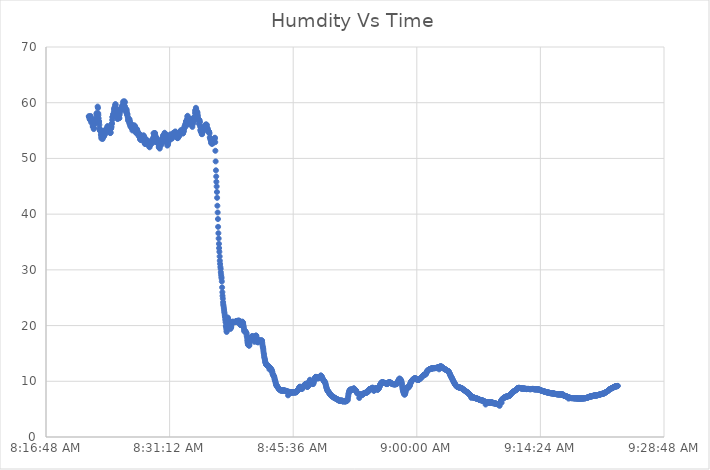
| Category | Series 0 |
|---|---|
| 42902.34846064815 | 57.571 |
| 42902.3484837963 | 57.523 |
| 42902.348495370374 | 57.436 |
| 42902.34851851852 | 57.364 |
| 42902.3485300926 | 57.088 |
| 42902.348553240736 | 56.951 |
| 42902.34856481482 | 57.135 |
| 42902.34858796296 | 57.487 |
| 42902.34861111111 | 57.617 |
| 42902.34862268518 | 57.181 |
| 42902.348645833335 | 56.824 |
| 42902.348657407405 | 56.481 |
| 42902.34868055556 | 56.993 |
| 42902.34869212963 | 57.133 |
| 42902.34871527778 | 56.679 |
| 42902.34873842592 | 56.802 |
| 42902.348750000005 | 56.617 |
| 42902.348773148144 | 56.071 |
| 42902.34878472223 | 55.691 |
| 42902.34880787037 | 55.78 |
| 42902.34881944445 | 55.854 |
| 42902.34884259259 | 55.624 |
| 42902.34886574074 | 55.266 |
| 42902.34887731481 | 55.454 |
| 42902.34890046297 | 56.164 |
| 42902.348912037036 | 56.694 |
| 42902.34893518519 | 56.746 |
| 42902.34894675926 | 56.82 |
| 42902.34896990741 | 56.906 |
| 42902.34898148148 | 56.856 |
| 42902.34900462963 | 56.399 |
| 42902.349027777775 | 56.394 |
| 42902.34903935185 | 56.785 |
| 42902.3490625 | 57.356 |
| 42902.34908564815 | 57.986 |
| 42902.34909722222 | 58.134 |
| 42902.349120370374 | 57.883 |
| 42902.34917824074 | 59.304 |
| 42902.34920138889 | 59.05 |
| 42902.349224537036 | 58.099 |
| 42902.34923611111 | 57.751 |
| 42902.34925925926 | 57.194 |
| 42902.349282407406 | 56.665 |
| 42902.34929398148 | 56.574 |
| 42902.34931712963 | 56.044 |
| 42902.349328703705 | 55.42 |
| 42902.34935185185 | 55.122 |
| 42902.34936342592 | 55.009 |
| 42902.349386574075 | 54.946 |
| 42902.34940972222 | 55.121 |
| 42902.3494212963 | 55.012 |
| 42902.349444444444 | 54.326 |
| 42902.34945601852 | 54.165 |
| 42902.34947916667 | 53.788 |
| 42902.349490740744 | 53.561 |
| 42902.34951388889 | 53.738 |
| 42902.34953703704 | 53.953 |
| 42902.34954861111 | 54.308 |
| 42902.34957175926 | 53.746 |
| 42902.34958333333 | 53.486 |
| 42902.34960648148 | 53.768 |
| 42902.34962962963 | 53.998 |
| 42902.349641203706 | 54.842 |
| 42902.34966435185 | 54.798 |
| 42902.3496875 | 54.356 |
| 42902.349699074075 | 53.967 |
| 42902.34972222222 | 54.149 |
| 42902.349745370375 | 54.293 |
| 42902.349768518514 | 54.377 |
| 42902.34979166667 | 55.054 |
| 42902.34980324074 | 54.883 |
| 42902.34982638889 | 54.853 |
| 42902.349849537044 | 55.26 |
| 42902.34986111111 | 54.956 |
| 42902.34988425925 | 55.215 |
| 42902.34989583334 | 55.299 |
| 42902.349918981476 | 55.247 |
| 42902.34993055556 | 55.167 |
| 42902.3499537037 | 55.414 |
| 42902.34996527778 | 55.686 |
| 42902.34998842592 | 55.815 |
| 42902.350011574075 | 55.551 |
| 42902.35003472222 | 55.135 |
| 42902.3500462963 | 55.289 |
| 42902.350069444445 | 54.943 |
| 42902.35008101852 | 54.953 |
| 42902.35010416666 | 54.772 |
| 42902.350115740745 | 54.876 |
| 42902.35013888888 | 54.779 |
| 42902.35016203704 | 54.657 |
| 42902.35017361111 | 54.893 |
| 42902.35019675926 | 54.55 |
| 42902.35020833333 | 54.609 |
| 42902.35023148148 | 54.681 |
| 42902.35024305555 | 55.31 |
| 42902.350266203706 | 55.404 |
| 42902.350277777776 | 55.486 |
| 42902.35030092593 | 55.73 |
| 42902.35032407407 | 56.229 |
| 42902.35033564815 | 56.304 |
| 42902.35035879629 | 56.907 |
| 42902.350370370375 | 57.427 |
| 42902.350393518514 | 57.46 |
| 42902.35041666667 | 57.494 |
| 42902.35042824074 | 57.866 |
| 42902.35045138889 | 57.889 |
| 42902.35046296296 | 57.999 |
| 42902.350486111114 | 58.299 |
| 42902.35050925926 | 58.71 |
| 42902.35052083334 | 58.928 |
| 42902.35054398148 | 59.124 |
| 42902.35055555556 | 58.975 |
| 42902.3505787037 | 59.14 |
| 42902.35059027778 | 59.464 |
| 42902.35061342592 | 59.761 |
| 42902.350636574076 | 59.614 |
| 42902.350648148145 | 59 |
| 42902.3506712963 | 58.849 |
| 42902.35068287037 | 58.852 |
| 42902.35070601852 | 58.213 |
| 42902.35071759259 | 58.135 |
| 42902.350740740745 | 57.909 |
| 42902.350763888884 | 57.803 |
| 42902.35077546297 | 57.182 |
| 42902.35079861111 | 57.069 |
| 42902.35081018519 | 57.222 |
| 42902.35083333333 | 57.658 |
| 42902.350856481484 | 58.204 |
| 42902.35086805555 | 57.992 |
| 42902.35089120371 | 57.689 |
| 42902.350914351846 | 57.244 |
| 42902.3509375 | 57.223 |
| 42902.35096064815 | 57.842 |
| 42902.35097222222 | 58.209 |
| 42902.350995370376 | 58.821 |
| 42902.351018518515 | 58.646 |
| 42902.3510300926 | 58.915 |
| 42902.35105324074 | 58.618 |
| 42902.35107638889 | 58.968 |
| 42902.35109953703 | 59.17 |
| 42902.351111111115 | 58.862 |
| 42902.351134259254 | 59.118 |
| 42902.35115740741 | 59.461 |
| 42902.35116898148 | 58.892 |
| 42902.35119212963 | 59.161 |
| 42902.35121527778 | 59.458 |
| 42902.35122685185 | 59.629 |
| 42902.35125 | 60.123 |
| 42902.35126157408 | 60.238 |
| 42902.35128472222 | 59.785 |
| 42902.3512962963 | 59.336 |
| 42902.35131944444 | 60.028 |
| 42902.35133101852 | 60.094 |
| 42902.35135416666 | 60.245 |
| 42902.351377314815 | 60.065 |
| 42902.351388888885 | 59.368 |
| 42902.35141203704 | 58.669 |
| 42902.35142361111 | 58.712 |
| 42902.35144675926 | 58.731 |
| 42902.35145833333 | 58.577 |
| 42902.351481481484 | 58.297 |
| 42902.35150462963 | 58.854 |
| 42902.35151620371 | 58.711 |
| 42902.35153935185 | 58.375 |
| 42902.35155092593 | 57.865 |
| 42902.35157407407 | 57.957 |
| 42902.35158564815 | 57.937 |
| 42902.35160879629 | 57.513 |
| 42902.351631944446 | 57.219 |
| 42902.351643518516 | 56.784 |
| 42902.35166666667 | 56.9 |
| 42902.351689814815 | 56.914 |
| 42902.35170138889 | 56.878 |
| 42902.35172453704 | 57.088 |
| 42902.351736111115 | 56.322 |
| 42902.35175925926 | 56.997 |
| 42902.35178240741 | 56.703 |
| 42902.35179398148 | 56.173 |
| 42902.35181712963 | 55.996 |
| 42902.3518287037 | 55.759 |
| 42902.351851851854 | 55.805 |
| 42902.351875 | 56.235 |
| 42902.35188657408 | 56.019 |
| 42902.35190972222 | 55.5 |
| 42902.35193287037 | 55.498 |
| 42902.35194444444 | 55.526 |
| 42902.35196759259 | 55.481 |
| 42902.351990740746 | 55.027 |
| 42902.352013888885 | 55.55 |
| 42902.35202546297 | 55.899 |
| 42902.35204861111 | 55.892 |
| 42902.352060185185 | 55.513 |
| 42902.35208333333 | 55.086 |
| 42902.352106481485 | 55.217 |
| 42902.352118055554 | 55.479 |
| 42902.35214120371 | 55.936 |
| 42902.35215277778 | 55.814 |
| 42902.35217592593 | 55.864 |
| 42902.35219907407 | 55.746 |
| 42902.352210648154 | 55.464 |
| 42902.35223379629 | 55.41 |
| 42902.35224537037 | 55.284 |
| 42902.352268518516 | 54.992 |
| 42902.35228009259 | 54.612 |
| 42902.35230324074 | 54.564 |
| 42902.35231481481 | 54.794 |
| 42902.35233796296 | 55.173 |
| 42902.352361111116 | 55.259 |
| 42902.352372685185 | 54.772 |
| 42902.35239583333 | 54.613 |
| 42902.35240740741 | 54.945 |
| 42902.352430555555 | 54.568 |
| 42902.35244212963 | 54.533 |
| 42902.35246527778 | 54.427 |
| 42902.352488425924 | 54.036 |
| 42902.3525 | 54.229 |
| 42902.35252314815 | 54.39 |
| 42902.35253472222 | 54.463 |
| 42902.35255787037 | 54.332 |
| 42902.35256944444 | 54.27 |
| 42902.35259259259 | 53.899 |
| 42902.35260416666 | 53.489 |
| 42902.352627314816 | 53.452 |
| 42902.35265046296 | 53.555 |
| 42902.35266203704 | 53.297 |
| 42902.352685185186 | 53.419 |
| 42902.35269675926 | 53.441 |
| 42902.35271990741 | 53.328 |
| 42902.352731481486 | 53.546 |
| 42902.352754629625 | 53.976 |
| 42902.35277777778 | 53.828 |
| 42902.35278935185 | 53.784 |
| 42902.3528125 | 53.717 |
| 42902.35282407407 | 53.97 |
| 42902.352847222224 | 53.924 |
| 42902.352858796294 | 54.056 |
| 42902.35288194445 | 53.942 |
| 42902.35289351852 | 54.149 |
| 42902.35291666667 | 54.006 |
| 42902.35293981482 | 53.829 |
| 42902.35295138889 | 53.189 |
| 42902.35297453703 | 52.791 |
| 42902.352997685186 | 52.622 |
| 42902.353009259255 | 52.709 |
| 42902.35303240741 | 52.6 |
| 42902.35304398148 | 52.687 |
| 42902.35306712963 | 53.103 |
| 42902.35309027778 | 53.32 |
| 42902.353101851855 | 53.437 |
| 42902.353124999994 | 53.366 |
| 42902.35313657408 | 52.906 |
| 42902.35315972222 | 52.644 |
| 42902.35318287037 | 52.919 |
| 42902.35319444444 | 52.858 |
| 42902.353217592594 | 52.875 |
| 42902.35322916666 | 52.486 |
| 42902.35325231482 | 52.725 |
| 42902.35326388889 | 52.999 |
| 42902.35328703704 | 52.771 |
| 42902.35331018518 | 52.711 |
| 42902.35332175926 | 52.312 |
| 42902.3533449074 | 52.487 |
| 42902.353356481486 | 52.181 |
| 42902.353379629625 | 52 |
| 42902.35340277778 | 52.572 |
| 42902.35341435185 | 52.322 |
| 42902.3534375 | 52.458 |
| 42902.35344907407 | 52.463 |
| 42902.353472222225 | 52.938 |
| 42902.35349537037 | 53.089 |
| 42902.35350694445 | 53.041 |
| 42902.35353009259 | 53.224 |
| 42902.35354166667 | 53.206 |
| 42902.35356481481 | 53.103 |
| 42902.35357638889 | 52.876 |
| 42902.35359953703 | 53.251 |
| 42902.35362268519 | 53.06 |
| 42902.353634259256 | 52.785 |
| 42902.35365740741 | 53.05 |
| 42902.35366898148 | 53.607 |
| 42902.35369212963 | 53.788 |
| 42902.3537037037 | 54.516 |
| 42902.353726851856 | 54.475 |
| 42902.353738425925 | 53.998 |
| 42902.35376157408 | 53.848 |
| 42902.35378472222 | 54.066 |
| 42902.353796296295 | 54.518 |
| 42902.35381944444 | 54.55 |
| 42902.35383101852 | 54.269 |
| 42902.353854166664 | 53.942 |
| 42902.35386574074 | 53.487 |
| 42902.35388888889 | 53.27 |
| 42902.35391203704 | 53.297 |
| 42902.35392361111 | 53.788 |
| 42902.35394675926 | 53.663 |
| 42902.35395833333 | 52.976 |
| 42902.35398148149 | 52.951 |
| 42902.353993055556 | 53.3 |
| 42902.35401620371 | 52.744 |
| 42902.35403935185 | 52.769 |
| 42902.354050925926 | 52.688 |
| 42902.35407407407 | 52.971 |
| 42902.35408564815 | 52.771 |
| 42902.354108796295 | 52.675 |
| 42902.35412037037 | 52.049 |
| 42902.35414351852 | 51.967 |
| 42902.35415509259 | 52.093 |
| 42902.35417824074 | 52.508 |
| 42902.354201388895 | 51.767 |
| 42902.354212962964 | 52.197 |
| 42902.35423611112 | 52.533 |
| 42902.35424768519 | 52.884 |
| 42902.35427083333 | 52.653 |
| 42902.35428240741 | 52.737 |
| 42902.35430555555 | 52.375 |
| 42902.3543287037 | 52.626 |
| 42902.35434027777 | 52.701 |
| 42902.354363425926 | 53.345 |
| 42902.354374999995 | 53.381 |
| 42902.35439814815 | 53.559 |
| 42902.35440972222 | 53.038 |
| 42902.35443287037 | 53.188 |
| 42902.35444444444 | 53.677 |
| 42902.354467592595 | 54.117 |
| 42902.354490740734 | 54.017 |
| 42902.35450231482 | 54.073 |
| 42902.35452546296 | 53.671 |
| 42902.35453703704 | 54.044 |
| 42902.35456018518 | 54.254 |
| 42902.354571759264 | 54.323 |
| 42902.3545949074 | 54.605 |
| 42902.35461805556 | 54.187 |
| 42902.354629629626 | 54.471 |
| 42902.35465277778 | 54.194 |
| 42902.35466435185 | 54.343 |
| 42902.3546875 | 54.321 |
| 42902.35469907407 | 54.104 |
| 42902.354722222226 | 53.244 |
| 42902.354733796295 | 52.933 |
| 42902.35475694445 | 53.227 |
| 42902.35478009259 | 53.747 |
| 42902.354791666665 | 52.749 |
| 42902.35481481481 | 52.306 |
| 42902.35482638889 | 52.543 |
| 42902.354849537034 | 52.689 |
| 42902.35486111111 | 52.429 |
| 42902.35488425926 | 52.795 |
| 42902.35490740741 | 53.094 |
| 42902.35491898148 | 53.076 |
| 42902.354942129634 | 53.235 |
| 42902.3549537037 | 53.546 |
| 42902.35497685186 | 53.822 |
| 42902.354999999996 | 54 |
| 42902.35501157407 | 54.05 |
| 42902.35503472222 | 54.027 |
| 42902.355046296296 | 54.271 |
| 42902.35506944444 | 54.285 |
| 42902.35508101852 | 53.67 |
| 42902.355104166665 | 53.923 |
| 42902.35512731482 | 53.875 |
| 42902.35513888889 | 54.072 |
| 42902.35516203704 | 54.156 |
| 42902.35517361111 | 53.515 |
| 42902.355196759265 | 53.661 |
| 42902.355219907404 | 54.01 |
| 42902.35523148149 | 54.046 |
| 42902.35525462963 | 54.21 |
| 42902.355266203704 | 54.158 |
| 42902.35528935185 | 54.265 |
| 42902.35530092593 | 54.593 |
| 42902.35532407407 | 54.455 |
| 42902.35534722223 | 54.225 |
| 42902.355358796296 | 54.256 |
| 42902.35538194445 | 54.62 |
| 42902.35539351852 | 54.513 |
| 42902.35541666667 | 54.289 |
| 42902.35543981481 | 54.73 |
| 42902.355462962965 | 54.84 |
| 42902.355486111104 | 54.704 |
| 42902.35550925926 | 54.416 |
| 42902.35552083333 | 54.352 |
| 42902.35554398148 | 54.328 |
| 42902.35555555555 | 53.979 |
| 42902.355578703704 | 54.156 |
| 42902.35559027777 | 53.804 |
| 42902.35561342593 | 53.708 |
| 42902.35563657407 | 53.631 |
| 42902.35564814815 | 53.707 |
| 42902.355671296296 | 53.666 |
| 42902.35568287037 | 53.748 |
| 42902.35570601851 | 53.949 |
| 42902.355729166666 | 54.314 |
| 42902.355740740735 | 54.179 |
| 42902.35576388889 | 53.956 |
| 42902.35577546296 | 54.125 |
| 42902.35579861111 | 54.383 |
| 42902.35581018518 | 54.719 |
| 42902.355833333335 | 54.755 |
| 42902.35585648148 | 54.518 |
| 42902.35587962963 | 54.46 |
| 42902.355891203704 | 54.702 |
| 42902.35591435185 | 55.066 |
| 42902.35592592593 | 54.693 |
| 42902.35594907407 | 55.016 |
| 42902.35596064814 | 54.699 |
| 42902.3559837963 | 54.753 |
| 42902.35600694444 | 54.989 |
| 42902.35601851852 | 54.819 |
| 42902.356041666666 | 54.585 |
| 42902.35605324074 | 54.761 |
| 42902.35607638889 | 54.474 |
| 42902.356087962966 | 54.523 |
| 42902.35611111111 | 54.68 |
| 42902.35613425926 | 54.933 |
| 42902.356145833335 | 54.885 |
| 42902.35616898148 | 55.323 |
| 42902.35618055555 | 55.431 |
| 42902.356203703705 | 55.724 |
| 42902.356215277774 | 55.592 |
| 42902.35623842593 | 55.588 |
| 42902.356261574074 | 55.88 |
| 42902.35627314815 | 56.105 |
| 42902.3562962963 | 56.123 |
| 42902.356307870374 | 56.314 |
| 42902.35633101852 | 56.608 |
| 42902.3563425926 | 56.72 |
| 42902.356365740736 | 56.426 |
| 42902.35637731482 | 56.681 |
| 42902.35640046296 | 56.858 |
| 42902.35642361111 | 57.076 |
| 42902.35643518518 | 57.5 |
| 42902.356458333335 | 57.652 |
| 42902.35648148148 | 56.986 |
| 42902.35649305556 | 56.43 |
| 42902.3565162037 | 56.088 |
| 42902.35652777778 | 56.23 |
| 42902.35655092592 | 56.406 |
| 42902.356562500005 | 56.815 |
| 42902.356585648144 | 56.884 |
| 42902.35659722223 | 57.104 |
| 42902.35662037037 | 56.883 |
| 42902.35664351852 | 56.778 |
| 42902.35665509259 | 57.137 |
| 42902.35667824074 | 56.904 |
| 42902.35668981481 | 56.577 |
| 42902.35671296297 | 56.357 |
| 42902.356724537036 | 56.259 |
| 42902.35674768519 | 56.366 |
| 42902.35677083333 | 56.511 |
| 42902.35678240741 | 56.831 |
| 42902.35680555555 | 56.683 |
| 42902.35681712963 | 56.456 |
| 42902.356840277775 | 55.659 |
| 42902.35685185185 | 56.051 |
| 42902.356875 | 56.775 |
| 42902.35689814815 | 57.02 |
| 42902.35690972222 | 56.338 |
| 42902.356932870374 | 56.967 |
| 42902.356944444444 | 57.238 |
| 42902.3569675926 | 57.03 |
| 42902.35697916667 | 57.422 |
| 42902.35700231481 | 56.783 |
| 42902.35702546296 | 56.963 |
| 42902.357037037036 | 57.437 |
| 42902.35706018518 | 58.148 |
| 42902.35707175926 | 58.6 |
| 42902.357094907406 | 58.489 |
| 42902.35710648148 | 58.744 |
| 42902.35712962963 | 59.086 |
| 42902.35715277778 | 58.836 |
| 42902.35716435185 | 58.321 |
| 42902.357187500005 | 58.055 |
| 42902.357199074075 | 58.344 |
| 42902.35722222222 | 58.383 |
| 42902.3572337963 | 57.796 |
| 42902.357256944444 | 58.215 |
| 42902.35726851852 | 57.815 |
| 42902.35729166667 | 57.509 |
| 42902.35731481481 | 57.147 |
| 42902.35732638889 | 56.942 |
| 42902.35734953704 | 56.912 |
| 42902.35737268519 | 56.215 |
| 42902.35738425926 | 56.936 |
| 42902.35740740741 | 56.653 |
| 42902.35743055555 | 56.832 |
| 42902.357453703706 | 56.509 |
| 42902.357465277775 | 55.735 |
| 42902.35748842593 | 55.115 |
| 42902.357511574075 | 54.932 |
| 42902.35753472222 | 54.83 |
| 42902.35754629629 | 54.739 |
| 42902.357569444444 | 54.767 |
| 42902.3575925926 | 54.689 |
| 42902.35760416667 | 54.371 |
| 42902.35762731482 | 54.35 |
| 42902.35765046296 | 54.598 |
| 42902.35767361111 | 54.749 |
| 42902.35768518518 | 54.832 |
| 42902.35770833334 | 55.15 |
| 42902.357731481476 | 55.348 |
| 42902.35774305556 | 55.238 |
| 42902.3577662037 | 55.415 |
| 42902.35778935185 | 55.566 |
| 42902.357812500006 | 55.544 |
| 42902.357824074075 | 55.715 |
| 42902.35784722222 | 55.911 |
| 42902.35787037037 | 55.794 |
| 42902.35789351852 | 55.832 |
| 42902.35790509259 | 55.95 |
| 42902.357928240745 | 56.094 |
| 42902.35795138888 | 56.027 |
| 42902.35796296297 | 56.022 |
| 42902.35798611111 | 56.08 |
| 42902.35800925926 | 55.98 |
| 42902.35803240741 | 55.372 |
| 42902.35804398148 | 55.439 |
| 42902.35806712963 | 55.441 |
| 42902.358090277776 | 55.237 |
| 42902.35811342593 | 54.955 |
| 42902.358125 | 54.988 |
| 42902.35814814815 | 54.87 |
| 42902.35817129629 | 54.717 |
| 42902.358182870375 | 54.811 |
| 42902.358206018514 | 54.713 |
| 42902.35822916667 | 54.478 |
| 42902.358252314814 | 53.781 |
| 42902.35828703704 | 53.601 |
| 42902.358310185184 | 53.415 |
| 42902.35833333334 | 53.273 |
| 42902.35834490741 | 53.103 |
| 42902.35836805556 | 52.789 |
| 42902.3583912037 | 52.71 |
| 42902.35841435185 | 52.644 |
| 42902.35842592592 | 52.685 |
| 42902.358449074076 | 52.697 |
| 42902.35847222222 | 52.749 |
| 42902.3584837963 | 52.669 |
| 42902.358506944445 | 52.802 |
| 42902.35853009259 | 52.985 |
| 42902.358553240745 | 53.116 |
| 42902.358564814815 | 53.178 |
| 42902.35858796297 | 53.276 |
| 42902.35861111111 | 53.402 |
| 42902.35863425926 | 53.475 |
| 42902.35864583333 | 53.649 |
| 42902.358668981484 | 53.715 |
| 42902.35869212963 | 52.922 |
| 42902.35870370371 | 51.375 |
| 42902.358726851846 | 49.471 |
| 42902.35875 | 47.867 |
| 42902.35877314815 | 46.764 |
| 42902.35878472222 | 45.81 |
| 42902.358807870376 | 44.97 |
| 42902.358831018515 | 43.973 |
| 42902.3588425926 | 42.931 |
| 42902.35886574074 | 41.507 |
| 42902.35888888889 | 40.298 |
| 42902.35891203703 | 39.123 |
| 42902.358923611115 | 37.721 |
| 42902.358946759254 | 36.58 |
| 42902.35896990741 | 35.633 |
| 42902.35899305556 | 34.67 |
| 42902.35900462963 | 33.914 |
| 42902.35902777778 | 33.24 |
| 42902.35905092592 | 32.411 |
| 42902.3590625 | 31.637 |
| 42902.359085648146 | 31.064 |
| 42902.3591087963 | 30.523 |
| 42902.35913194444 | 30.174 |
| 42902.35914351852 | 29.584 |
| 42902.35916666666 | 29.143 |
| 42902.359189814815 | 28.771 |
| 42902.359201388885 | 28.481 |
| 42902.35922453704 | 27.914 |
| 42902.359247685185 | 26.853 |
| 42902.35927083333 | 25.987 |
| 42902.35928240741 | 25.338 |
| 42902.359305555554 | 24.838 |
| 42902.35932870371 | 24.21 |
| 42902.35934027778 | 23.803 |
| 42902.35936342593 | 23.536 |
| 42902.35938657407 | 23.177 |
| 42902.35940972222 | 22.813 |
| 42902.35942129629 | 22.475 |
| 42902.359444444446 | 22.178 |
| 42902.35946759259 | 21.778 |
| 42902.35947916667 | 21.541 |
| 42902.359502314815 | 21.055 |
| 42902.35952546296 | 20.612 |
| 42902.359548611115 | 19.95 |
| 42902.359560185185 | 19.853 |
| 42902.35958333334 | 19.455 |
| 42902.35960648148 | 19.062 |
| 42902.35961805556 | 18.852 |
| 42902.3596412037 | 19.606 |
| 42902.359664351854 | 20.498 |
| 42902.3596875 | 21.283 |
| 42902.35971064815 | 21.443 |
| 42902.3597337963 | 21.236 |
| 42902.35974537037 | 20.945 |
| 42902.35976851852 | 20.502 |
| 42902.35979166666 | 20.087 |
| 42902.359803240746 | 19.91 |
| 42902.359826388885 | 20.362 |
| 42902.35984953704 | 20.405 |
| 42902.359872685185 | 20.364 |
| 42902.3599074074 | 19.606 |
| 42902.359918981485 | 19.398 |
| 42902.359942129624 | 19.534 |
| 42902.35996527778 | 19.7 |
| 42902.35998842593 | 19.768 |
| 42902.36 | 20.136 |
| 42902.360023148154 | 20.338 |
| 42902.36004629629 | 20.54 |
| 42902.36005787037 | 20.536 |
| 42902.360081018516 | 20.597 |
| 42902.36010416667 | 20.706 |
| 42902.36012731481 | 20.651 |
| 42902.36013888889 | 20.671 |
| 42902.36016203703 | 20.624 |
| 42902.360185185185 | 20.62 |
| 42902.36020833333 | 20.632 |
| 42902.36021990741 | 20.645 |
| 42902.360243055555 | 20.628 |
| 42902.3602662037 | 20.633 |
| 42902.36027777778 | 20.617 |
| 42902.360300925924 | 20.627 |
| 42902.36032407408 | 20.651 |
| 42902.36034722222 | 20.718 |
| 42902.3603587963 | 20.738 |
| 42902.36038194444 | 20.779 |
| 42902.36040509259 | 20.806 |
| 42902.36041666666 | 20.831 |
| 42902.360439814816 | 20.73 |
| 42902.36046296296 | 20.659 |
| 42902.36048611111 | 20.656 |
| 42902.360497685186 | 20.673 |
| 42902.36052083333 | 20.708 |
| 42902.360543981486 | 20.733 |
| 42902.360567129625 | 20.842 |
| 42902.36057870371 | 20.932 |
| 42902.36060185185 | 20.825 |
| 42902.360625 | 20.821 |
| 42902.36063657407 | 20.786 |
| 42902.360659722224 | 20.719 |
| 42902.36068287037 | 20.385 |
| 42902.36070601852 | 20.197 |
| 42902.36071759259 | 20.142 |
| 42902.36074074074 | 20.143 |
| 42902.36076388889 | 20.189 |
| 42902.36078703703 | 20.16 |
| 42902.36079861112 | 20.094 |
| 42902.360821759255 | 20.058 |
| 42902.36084490741 | 20.147 |
| 42902.360868055555 | 20.382 |
| 42902.36087962963 | 20.716 |
| 42902.36090277778 | 20.639 |
| 42902.360925925925 | 20.505 |
| 42902.36094907408 | 20.432 |
| 42902.36096064815 | 20.142 |
| 42902.3609837963 | 19.897 |
| 42902.36100694444 | 19.603 |
| 42902.361018518524 | 19.307 |
| 42902.36104166666 | 18.982 |
| 42902.36106481482 | 19.019 |
| 42902.361087962956 | 18.899 |
| 42902.36109953704 | 18.924 |
| 42902.36112268518 | 18.964 |
| 42902.36114583333 | 19.001 |
| 42902.3611574074 | 18.789 |
| 42902.361180555556 | 18.743 |
| 42902.36120370371 | 18.663 |
| 42902.36122685185 | 18.599 |
| 42902.361238425925 | 18.176 |
| 42902.36126157407 | 17.848 |
| 42902.361284722225 | 17.38 |
| 42902.36130787037 | 17.04 |
| 42902.36131944445 | 16.798 |
| 42902.36134259259 | 16.649 |
| 42902.36136574074 | 16.542 |
| 42902.36137731481 | 16.505 |
| 42902.36140046296 | 16.45 |
| 42902.36142361111 | 16.42 |
| 42902.361446759256 | 16.402 |
| 42902.36145833333 | 16.647 |
| 42902.36148148148 | 17.073 |
| 42902.36150462963 | 17.192 |
| 42902.3615162037 | 17.576 |
| 42902.361539351856 | 17.697 |
| 42902.361562499995 | 17.779 |
| 42902.36158564815 | 17.846 |
| 42902.36159722222 | 17.903 |
| 42902.36162037037 | 17.931 |
| 42902.36164351852 | 18.041 |
| 42902.361655092594 | 18.04 |
| 42902.36167824074 | 18.047 |
| 42902.36170138889 | 18.056 |
| 42902.36172453704 | 18.057 |
| 42902.36173611111 | 17.98 |
| 42902.36175925926 | 18.009 |
| 42902.3617824074 | 18.029 |
| 42902.361805555556 | 17.9 |
| 42902.361817129626 | 17.554 |
| 42902.36184027778 | 17.371 |
| 42902.361863425926 | 17.333 |
| 42902.361875 | 17.082 |
| 42902.36189814815 | 17.426 |
| 42902.361921296295 | 17.769 |
| 42902.36194444445 | 17.995 |
| 42902.36195601852 | 18.13 |
| 42902.36197916667 | 18.196 |
| 42902.36200231481 | 18.202 |
| 42902.362013888895 | 18.134 |
| 42902.36203703703 | 17.836 |
| 42902.36206018519 | 17.609 |
| 42902.36208333333 | 17.425 |
| 42902.36209490741 | 17.226 |
| 42902.36211805555 | 17.09 |
| 42902.3621412037 | 16.975 |
| 42902.36215277777 | 17.085 |
| 42902.362175925926 | 17.182 |
| 42902.36219907408 | 17.25 |
| 42902.36222222222 | 17.291 |
| 42902.3622337963 | 17.333 |
| 42902.36225694444 | 17.353 |
| 42902.362280092595 | 17.318 |
| 42902.362303240734 | 17.269 |
| 42902.36231481482 | 17.25 |
| 42902.36233796296 | 17.249 |
| 42902.36236111111 | 17.264 |
| 42902.36237268518 | 17.267 |
| 42902.362395833334 | 17.248 |
| 42902.36241898148 | 17.308 |
| 42902.362442129626 | 17.327 |
| 42902.3624537037 | 17.354 |
| 42902.36247685185 | 17.235 |
| 42902.3625 | 16.865 |
| 42902.36251157407 | 16.545 |
| 42902.362534722226 | 16.232 |
| 42902.362557870365 | 16.022 |
| 42902.36258101852 | 15.751 |
| 42902.36259259259 | 15.386 |
| 42902.36261574074 | 15.041 |
| 42902.36263888889 | 14.765 |
| 42902.362650462965 | 14.431 |
| 42902.36267361111 | 14.223 |
| 42902.36269675926 | 14.01 |
| 42902.36271990741 | 13.795 |
| 42902.36273148148 | 13.505 |
| 42902.362754629634 | 13.36 |
| 42902.36277777777 | 13.239 |
| 42902.36280092593 | 13.036 |
| 42902.362812499996 | 13.012 |
| 42902.36283564815 | 12.984 |
| 42902.362858796296 | 12.928 |
| 42902.36287037037 | 12.904 |
| 42902.36289351852 | 12.823 |
| 42902.362916666665 | 12.836 |
| 42902.36293981482 | 12.84 |
| 42902.36295138889 | 12.729 |
| 42902.36297453704 | 12.734 |
| 42902.36299768518 | 12.733 |
| 42902.363009259265 | 12.716 |
| 42902.363032407404 | 12.658 |
| 42902.36305555556 | 12.539 |
| 42902.363078703704 | 12.131 |
| 42902.36309027778 | 12.505 |
| 42902.36311342593 | 12.445 |
| 42902.36313657407 | 12.391 |
| 42902.36315972223 | 12.26 |
| 42902.363171296296 | 12.247 |
| 42902.36319444445 | 12.214 |
| 42902.36321759259 | 12.198 |
| 42902.36322916667 | 12.12 |
| 42902.36325231481 | 12.041 |
| 42902.363275462965 | 11.886 |
| 42902.363298611104 | 11.723 |
| 42902.36331018519 | 11.616 |
| 42902.36333333333 | 11.322 |
| 42902.36335648148 | 11.262 |
| 42902.36336805555 | 11.183 |
| 42902.363391203704 | 11.049 |
| 42902.36341435186 | 10.974 |
| 42902.3634375 | 10.938 |
| 42902.36344907407 | 10.855 |
| 42902.36347222222 | 10.728 |
| 42902.36349537037 | 10.469 |
| 42902.36350694444 | 10.279 |
| 42902.363530092596 | 10.155 |
| 42902.363553240735 | 10.04 |
| 42902.36357638889 | 9.835 |
| 42902.36358796296 | 9.622 |
| 42902.36361111111 | 9.465 |
| 42902.36363425926 | 9.32 |
| 42902.363645833335 | 9.272 |
| 42902.36366898148 | 9.23 |
| 42902.36369212963 | 9.137 |
| 42902.36371527778 | 9.088 |
| 42902.36372685185 | 8.991 |
| 42902.363750000004 | 8.882 |
| 42902.36377314814 | 8.881 |
| 42902.36378472223 | 8.796 |
| 42902.363807870366 | 8.781 |
| 42902.36383101852 | 8.718 |
| 42902.363854166666 | 8.578 |
| 42902.36386574074 | 8.562 |
| 42902.36388888889 | 8.551 |
| 42902.363912037035 | 8.502 |
| 42902.36393518519 | 8.475 |
| 42902.36394675926 | 8.389 |
| 42902.36396990741 | 8.393 |
| 42902.36399305555 | 8.349 |
| 42902.364004629635 | 8.38 |
| 42902.364027777774 | 8.377 |
| 42902.36405092593 | 8.329 |
| 42902.364074074074 | 8.394 |
| 42902.36408564815 | 8.373 |
| 42902.3641087963 | 8.363 |
| 42902.36413194444 | 8.299 |
| 42902.3641550926 | 8.329 |
| 42902.364166666666 | 8.336 |
| 42902.36418981482 | 8.351 |
| 42902.36421296296 | 8.359 |
| 42902.36422453704 | 8.328 |
| 42902.36424768518 | 8.361 |
| 42902.364270833335 | 8.338 |
| 42902.36429398148 | 8.365 |
| 42902.36430555556 | 8.309 |
| 42902.3643287037 | 8.294 |
| 42902.36435185185 | 8.271 |
| 42902.36436342592 | 8.277 |
| 42902.364386574074 | 8.27 |
| 42902.36440972223 | 8.262 |
| 42902.36443287037 | 8.263 |
| 42902.36444444445 | 8.274 |
| 42902.36446759259 | 8.208 |
| 42902.36449074074 | 8.204 |
| 42902.36450231481 | 8.192 |
| 42902.36452546297 | 8.167 |
| 42902.364548611105 | 8.131 |
| 42902.36457175926 | 8.124 |
| 42902.36458333333 | 7.474 |
| 42902.36460648148 | 8.087 |
| 42902.36462962963 | 8.137 |
| 42902.364641203705 | 8.083 |
| 42902.36466435185 | 8.061 |
| 42902.3646875 | 7.996 |
| 42902.36471064815 | 8.009 |
| 42902.36472222222 | 8.014 |
| 42902.364745370374 | 7.968 |
| 42902.36476851851 | 7.972 |
| 42902.3647800926 | 7.968 |
| 42902.36480324074 | 7.982 |
| 42902.36482638889 | 7.963 |
| 42902.364849537036 | 7.998 |
| 42902.36486111111 | 8.038 |
| 42902.36488425926 | 8.014 |
| 42902.364907407406 | 7.972 |
| 42902.36493055556 | 8.009 |
| 42902.36494212963 | 8.013 |
| 42902.36496527778 | 8.018 |
| 42902.36498842592 | 7.995 |
| 42902.365011574075 | 8.006 |
| 42902.365023148144 | 8.013 |
| 42902.3650462963 | 8.045 |
| 42902.365069444444 | 8.037 |
| 42902.36508101852 | 8.022 |
| 42902.36510416667 | 7.976 |
| 42902.36512731481 | 8.02 |
| 42902.36515046297 | 8.065 |
| 42902.36516203704 | 8.018 |
| 42902.36518518519 | 8.024 |
| 42902.36520833333 | 8.043 |
| 42902.36521990741 | 8.034 |
| 42902.36524305555 | 8.015 |
| 42902.365266203706 | 8.13 |
| 42902.36528935185 | 8.263 |
| 42902.36530092593 | 8.297 |
| 42902.365324074075 | 8.297 |
| 42902.36534722222 | 8.355 |
| 42902.36535879629 | 8.38 |
| 42902.365381944444 | 8.356 |
| 42902.3654050926 | 8.441 |
| 42902.36542824074 | 8.527 |
| 42902.36543981482 | 8.639 |
| 42902.36546296296 | 8.762 |
| 42902.36548611111 | 8.874 |
| 42902.36550925925 | 8.974 |
| 42902.36552083334 | 8.971 |
| 42902.365543981476 | 9.032 |
| 42902.36556712963 | 8.996 |
| 42902.3655787037 | 8.968 |
| 42902.36560185185 | 8.95 |
| 42902.365625000006 | 8.901 |
| 42902.365648148145 | 8.842 |
| 42902.36565972222 | 8.799 |
| 42902.36568287037 | 8.699 |
| 42902.36570601852 | 8.641 |
| 42902.36571759259 | 8.666 |
| 42902.365740740745 | 8.72 |
| 42902.36576388888 | 8.761 |
| 42902.36578703704 | 8.871 |
| 42902.36579861111 | 8.997 |
| 42902.36582175926 | 9.068 |
| 42902.36584490741 | 9.15 |
| 42902.36585648148 | 9.223 |
| 42902.36587962963 | 9.285 |
| 42902.365902777776 | 9.274 |
| 42902.36592592593 | 9.341 |
| 42902.3659375 | 9.394 |
| 42902.36596064815 | 9.429 |
| 42902.36598379629 | 9.5 |
| 42902.366006944445 | 9.564 |
| 42902.366018518514 | 9.378 |
| 42902.36604166667 | 9.316 |
| 42902.366064814814 | 9.224 |
| 42902.36607638889 | 9.161 |
| 42902.36609953704 | 9.09 |
| 42902.366122685184 | 9.074 |
| 42902.36614583334 | 9.023 |
| 42902.36615740741 | 9.01 |
| 42902.36618055556 | 9.065 |
| 42902.3662037037 | 9.123 |
| 42902.36621527778 | 9.228 |
| 42902.36623842592 | 9.377 |
| 42902.366261574076 | 9.532 |
| 42902.36628472222 | 9.651 |
| 42902.3662962963 | 9.964 |
| 42902.366319444445 | 10.023 |
| 42902.36634259259 | 10.096 |
| 42902.36635416667 | 10.273 |
| 42902.366377314815 | 10.133 |
| 42902.36640046297 | 9.982 |
| 42902.36642361111 | 9.9 |
| 42902.36643518519 | 9.828 |
| 42902.36645833333 | 9.798 |
| 42902.366481481484 | 9.713 |
| 42902.36650462963 | 9.698 |
| 42902.36651620371 | 9.681 |
| 42902.366539351846 | 9.62 |
| 42902.3665625 | 9.584 |
| 42902.36657407407 | 9.528 |
| 42902.36659722222 | 9.491 |
| 42902.366620370376 | 9.531 |
| 42902.366643518515 | 9.658 |
| 42902.3666550926 | 9.847 |
| 42902.36667824074 | 10.031 |
| 42902.36670138889 | 10.236 |
| 42902.36671296296 | 10.376 |
| 42902.366736111115 | 10.45 |
| 42902.366759259254 | 10.59 |
| 42902.36678240741 | 10.681 |
| 42902.36679398148 | 10.724 |
| 42902.36681712963 | 10.779 |
| 42902.36684027778 | 10.796 |
| 42902.36685185185 | 10.781 |
| 42902.366875 | 10.771 |
| 42902.366898148146 | 10.747 |
| 42902.3669212963 | 10.707 |
| 42902.36693287037 | 10.614 |
| 42902.36695601852 | 10.636 |
| 42902.36697916666 | 10.536 |
| 42902.36699074074 | 10.508 |
| 42902.367013888885 | 10.586 |
| 42902.36703703704 | 10.61 |
| 42902.367060185185 | 10.677 |
| 42902.36707175926 | 10.714 |
| 42902.36709490741 | 10.778 |
| 42902.367118055554 | 10.706 |
| 42902.36714120371 | 10.67 |
| 42902.36716435185 | 10.758 |
| 42902.36717592593 | 10.785 |
| 42902.36719907407 | 10.879 |
| 42902.36722222222 | 11.002 |
| 42902.36723379629 | 11.037 |
| 42902.367256944446 | 10.991 |
| 42902.36728009259 | 10.934 |
| 42902.36730324074 | 10.871 |
| 42902.367314814815 | 10.778 |
| 42902.36733796296 | 10.639 |
| 42902.367361111115 | 10.559 |
| 42902.36738425926 | 10.46 |
| 42902.36739583334 | 10.3 |
| 42902.36741898148 | 10.285 |
| 42902.36744212963 | 10.229 |
| 42902.36746527778 | 10.178 |
| 42902.367476851854 | 10.059 |
| 42902.3675 | 10.047 |
| 42902.36752314815 | 9.983 |
| 42902.36753472222 | 9.862 |
| 42902.36755787037 | 9.86 |
| 42902.36758101852 | 9.846 |
| 42902.36760416666 | 9.69 |
| 42902.367615740746 | 9.49 |
| 42902.367638888885 | 9.312 |
| 42902.36766203704 | 9.103 |
| 42902.367685185185 | 8.932 |
| 42902.36769675926 | 8.79 |
| 42902.3677199074 | 8.645 |
| 42902.367743055554 | 8.528 |
| 42902.367754629624 | 8.426 |
| 42902.36777777778 | 8.336 |
| 42902.36780092593 | 8.224 |
| 42902.36782407407 | 8.231 |
| 42902.367835648154 | 8.196 |
| 42902.36785879629 | 8.117 |
| 42902.36788194445 | 8.05 |
| 42902.367893518516 | 7.989 |
| 42902.36791666667 | 7.79 |
| 42902.36793981481 | 7.873 |
| 42902.36796296296 | 7.793 |
| 42902.36797453703 | 7.781 |
| 42902.367997685185 | 7.639 |
| 42902.36802083333 | 7.595 |
| 42902.36804398148 | 7.53 |
| 42902.368055555555 | 7.455 |
| 42902.3680787037 | 7.393 |
| 42902.368101851855 | 7.362 |
| 42902.368113425924 | 7.375 |
| 42902.36813657408 | 7.307 |
| 42902.36815972222 | 7.341 |
| 42902.36818287037 | 7.283 |
| 42902.36819444444 | 7.256 |
| 42902.36821759259 | 7.18 |
| 42902.36824074074 | 7.168 |
| 42902.368252314816 | 7.123 |
| 42902.36827546296 | 7.079 |
| 42902.36829861111 | 7.119 |
| 42902.36832175926 | 7.104 |
| 42902.36833333333 | 7.037 |
| 42902.368356481486 | 7.012 |
| 42902.368379629625 | 6.994 |
| 42902.36839120371 | 6.962 |
| 42902.36841435185 | 6.927 |
| 42902.3684375 | 6.927 |
| 42902.36846064815 | 6.903 |
| 42902.368472222224 | 6.828 |
| 42902.36849537037 | 6.822 |
| 42902.36851851852 | 6.807 |
| 42902.36854166667 | 6.785 |
| 42902.36855324074 | 6.786 |
| 42902.36857638889 | 6.777 |
| 42902.36859953703 | 6.734 |
| 42902.36861111112 | 6.658 |
| 42902.368634259255 | 6.652 |
| 42902.36865740741 | 6.609 |
| 42902.368680555555 | 6.553 |
| 42902.36869212963 | 6.568 |
| 42902.36871527778 | 6.573 |
| 42902.368738425925 | 6.536 |
| 42902.368749999994 | 6.567 |
| 42902.36877314815 | 6.541 |
| 42902.3687962963 | 6.507 |
| 42902.36881944444 | 6.475 |
| 42902.368831018524 | 6.489 |
| 42902.36885416666 | 6.46 |
| 42902.36887731482 | 6.516 |
| 42902.368900462956 | 6.562 |
| 42902.36891203704 | 6.518 |
| 42902.36893518518 | 6.516 |
| 42902.36895833333 | 6.508 |
| 42902.3689699074 | 6.476 |
| 42902.368993055556 | 6.403 |
| 42902.36901620371 | 6.435 |
| 42902.36903935185 | 6.437 |
| 42902.369050925925 | 6.347 |
| 42902.36907407407 | 6.466 |
| 42902.369097222225 | 6.468 |
| 42902.36912037037 | 6.433 |
| 42902.36913194445 | 6.464 |
| 42902.36915509259 | 6.476 |
| 42902.36917824074 | 6.426 |
| 42902.36918981481 | 6.374 |
| 42902.36921296296 | 6.388 |
| 42902.36923611111 | 6.429 |
| 42902.369259259256 | 6.411 |
| 42902.36927083333 | 6.443 |
| 42902.36929398148 | 6.442 |
| 42902.36931712963 | 6.439 |
| 42902.3693287037 | 6.512 |
| 42902.369351851856 | 6.531 |
| 42902.369374999995 | 6.544 |
| 42902.36939814815 | 6.602 |
| 42902.36940972222 | 6.771 |
| 42902.36943287037 | 7.067 |
| 42902.36945601852 | 7.369 |
| 42902.369467592594 | 7.671 |
| 42902.36949074074 | 7.882 |
| 42902.36951388889 | 8.028 |
| 42902.36953703704 | 8.207 |
| 42902.36954861111 | 8.307 |
| 42902.36957175926 | 8.381 |
| 42902.3695949074 | 8.453 |
| 42902.369618055556 | 8.491 |
| 42902.369629629626 | 8.518 |
| 42902.36965277778 | 8.504 |
| 42902.369675925926 | 8.506 |
| 42902.3696875 | 8.482 |
| 42902.36971064815 | 8.46 |
| 42902.369733796295 | 8.487 |
| 42902.36975694445 | 8.468 |
| 42902.36976851852 | 8.458 |
| 42902.36979166667 | 8.511 |
| 42902.36981481481 | 8.547 |
| 42902.369826388895 | 8.553 |
| 42902.36984953703 | 8.625 |
| 42902.36987268519 | 8.676 |
| 42902.36989583333 | 8.691 |
| 42902.36990740741 | 8.703 |
| 42902.36993055555 | 8.692 |
| 42902.3699537037 | 8.64 |
| 42902.36996527777 | 8.589 |
| 42902.369988425926 | 8.539 |
| 42902.37001157408 | 8.49 |
| 42902.37003472222 | 8.405 |
| 42902.3700462963 | 8.41 |
| 42902.37006944444 | 8.361 |
| 42902.370092592595 | 8.277 |
| 42902.370104166665 | 8.188 |
| 42902.37012731482 | 8.064 |
| 42902.37015046296 | 7.977 |
| 42902.37017361111 | 7.916 |
| 42902.37018518518 | 7.865 |
| 42902.370208333334 | 7.838 |
| 42902.37023148148 | 7.781 |
| 42902.370254629626 | 7.777 |
| 42902.3702662037 | 7.745 |
| 42902.37028935185 | 7.691 |
| 42902.3703125 | 7.675 |
| 42902.37032407407 | 7.63 |
| 42902.370347222226 | 7.003 |
| 42902.370370370365 | 7.562 |
| 42902.37039351852 | 7.62 |
| 42902.37040509259 | 7.641 |
| 42902.37042824074 | 7.609 |
| 42902.37045138889 | 7.622 |
| 42902.370462962965 | 7.609 |
| 42902.37048611111 | 7.591 |
| 42902.37050925926 | 7.608 |
| 42902.37053240741 | 7.639 |
| 42902.37054398148 | 7.585 |
| 42902.370567129634 | 7.576 |
| 42902.37059027777 | 7.583 |
| 42902.37060185186 | 7.611 |
| 42902.370624999996 | 7.598 |
| 42902.37064814815 | 7.691 |
| 42902.370671296296 | 7.735 |
| 42902.37068287037 | 7.777 |
| 42902.37070601852 | 7.835 |
| 42902.370729166665 | 7.839 |
| 42902.37074074074 | 7.831 |
| 42902.37076388889 | 7.864 |
| 42902.37078703704 | 7.905 |
| 42902.37081018518 | 7.919 |
| 42902.370821759265 | 7.892 |
| 42902.370844907404 | 7.949 |
| 42902.37086805556 | 7.962 |
| 42902.370891203704 | 7.955 |
| 42902.37090277778 | 7.97 |
| 42902.37092592593 | 7.963 |
| 42902.37094907407 | 7.954 |
| 42902.37096064814 | 8.005 |
| 42902.370983796296 | 8.063 |
| 42902.37100694445 | 8.162 |
| 42902.37103009259 | 8.203 |
| 42902.37104166667 | 8.252 |
| 42902.37106481481 | 8.196 |
| 42902.371087962965 | 8.162 |
| 42902.371099537035 | 8.329 |
| 42902.37112268519 | 8.465 |
| 42902.37114583333 | 8.496 |
| 42902.37116898148 | 8.569 |
| 42902.37118055555 | 8.61 |
| 42902.371203703704 | 8.624 |
| 42902.37122685186 | 8.604 |
| 42902.37123842593 | 8.625 |
| 42902.37126157407 | 8.608 |
| 42902.37128472222 | 8.555 |
| 42902.37130787037 | 8.67 |
| 42902.37131944444 | 8.7 |
| 42902.371342592596 | 8.687 |
| 42902.371365740735 | 8.729 |
| 42902.37137731482 | 8.796 |
| 42902.37140046296 | 8.839 |
| 42902.37142361111 | 8.847 |
| 42902.37144675926 | 8.803 |
| 42902.371458333335 | 8.659 |
| 42902.37148148148 | 8.481 |
| 42902.37150462963 | 8.402 |
| 42902.37152777778 | 8.289 |
| 42902.37153935185 | 8.347 |
| 42902.371562500004 | 8.401 |
| 42902.37158564814 | 8.469 |
| 42902.37159722223 | 8.464 |
| 42902.371620370366 | 8.537 |
| 42902.37164351852 | 8.588 |
| 42902.371666666666 | 8.63 |
| 42902.37167824074 | 8.783 |
| 42902.37170138889 | 8.805 |
| 42902.371724537035 | 8.765 |
| 42902.37174768519 | 8.743 |
| 42902.37175925926 | 8.715 |
| 42902.37178240741 | 8.627 |
| 42902.37180555555 | 8.519 |
| 42902.371817129635 | 8.521 |
| 42902.371840277774 | 8.491 |
| 42902.37186342593 | 8.52 |
| 42902.371886574074 | 8.61 |
| 42902.37189814815 | 8.668 |
| 42902.3719212963 | 8.732 |
| 42902.37194444444 | 8.794 |
| 42902.37195601852 | 8.89 |
| 42902.371979166666 | 8.982 |
| 42902.37200231482 | 9.09 |
| 42902.37202546296 | 9.255 |
| 42902.37203703704 | 9.416 |
| 42902.37206018518 | 9.489 |
| 42902.372083333335 | 9.593 |
| 42902.372094907405 | 9.634 |
| 42902.37211805556 | 9.695 |
| 42902.3721412037 | 9.75 |
| 42902.37216435185 | 9.801 |
| 42902.37217592592 | 9.816 |
| 42902.372199074074 | 9.81 |
| 42902.37222222223 | 9.826 |
| 42902.3722337963 | 9.83 |
| 42902.37225694445 | 9.789 |
| 42902.37228009259 | 9.773 |
| 42902.37230324074 | 9.756 |
| 42902.37231481481 | 9.738 |
| 42902.37233796297 | 9.704 |
| 42902.372361111105 | 9.732 |
| 42902.37237268519 | 9.707 |
| 42902.37239583333 | 9.7 |
| 42902.37241898148 | 9.714 |
| 42902.37244212963 | 9.694 |
| 42902.372453703705 | 9.664 |
| 42902.37247685185 | 9.653 |
| 42902.3725 | 9.61 |
| 42902.372511574074 | 9.571 |
| 42902.37253472222 | 9.503 |
| 42902.372557870374 | 9.549 |
| 42902.37258101851 | 9.547 |
| 42902.3725925926 | 9.489 |
| 42902.37261574074 | 9.578 |
| 42902.37263888889 | 9.598 |
| 42902.37265046296 | 9.609 |
| 42902.37267361111 | 9.673 |
| 42902.37269675926 | 9.717 |
| 42902.372719907406 | 9.78 |
| 42902.37273148148 | 9.826 |
| 42902.37275462963 | 9.838 |
| 42902.37277777778 | 9.852 |
| 42902.37280092592 | 9.825 |
| 42902.372812500005 | 9.828 |
| 42902.372835648144 | 9.821 |
| 42902.3728587963 | 9.759 |
| 42902.37287037037 | 9.747 |
| 42902.37289351852 | 9.711 |
| 42902.37291666667 | 9.619 |
| 42902.37293981481 | 9.604 |
| 42902.37295138889 | 9.633 |
| 42902.37297453704 | 9.581 |
| 42902.37299768519 | 9.57 |
| 42902.37300925926 | 9.561 |
| 42902.37303240741 | 9.528 |
| 42902.37305555555 | 9.489 |
| 42902.373078703706 | 9.508 |
| 42902.373090277775 | 9.51 |
| 42902.37311342593 | 9.445 |
| 42902.373136574075 | 9.459 |
| 42902.37314814815 | 9.482 |
| 42902.37317129629 | 9.472 |
| 42902.373194444444 | 9.48 |
| 42902.3732175926 | 9.463 |
| 42902.37322916667 | 9.447 |
| 42902.37325231482 | 9.448 |
| 42902.37327546296 | 9.491 |
| 42902.37329861111 | 9.485 |
| 42902.37331018518 | 9.482 |
| 42902.37333333334 | 9.494 |
| 42902.373356481476 | 9.498 |
| 42902.37336805556 | 9.501 |
| 42902.3733912037 | 9.565 |
| 42902.37341435185 | 9.699 |
| 42902.373437500006 | 9.783 |
| 42902.373449074075 | 9.913 |
| 42902.37347222222 | 10 |
| 42902.37349537037 | 10.01 |
| 42902.373506944445 | 10.092 |
| 42902.37353009259 | 10.217 |
| 42902.373553240745 | 10.297 |
| 42902.37357638888 | 10.402 |
| 42902.37358796297 | 10.461 |
| 42902.37361111111 | 10.485 |
| 42902.37363425926 | 10.401 |
| 42902.37364583333 | 10.382 |
| 42902.37366898148 | 10.325 |
| 42902.37369212963 | 10.258 |
| 42902.373715277776 | 10.201 |
| 42902.37372685185 | 10.148 |
| 42902.37375 | 10.03 |
| 42902.37377314815 | 9.798 |
| 42902.37379629629 | 9.547 |
| 42902.373807870375 | 9.235 |
| 42902.373831018514 | 8.927 |
| 42902.37385416667 | 8.685 |
| 42902.37386574074 | 8.487 |
| 42902.37388888889 | 8.27 |
| 42902.37391203704 | 8.121 |
| 42902.373935185184 | 7.987 |
| 42902.37394675926 | 7.869 |
| 42902.37396990741 | 7.75 |
| 42902.37399305556 | 7.674 |
| 42902.37400462963 | 7.611 |
| 42902.37402777778 | 7.631 |
| 42902.37405092592 | 7.752 |
| 42902.374074074076 | 7.907 |
| 42902.374085648145 | 8.071 |
| 42902.3741087963 | 8.297 |
| 42902.374131944445 | 8.482 |
| 42902.37415509259 | 8.666 |
| 42902.37416666667 | 8.799 |
| 42902.374189814815 | 8.856 |
| 42902.37421296297 | 8.916 |
| 42902.37422453704 | 8.897 |
| 42902.37424768519 | 8.896 |
| 42902.37427083333 | 8.868 |
| 42902.374293981484 | 8.827 |
| 42902.37430555555 | 8.861 |
| 42902.37432870371 | 8.922 |
| 42902.374351851846 | 8.965 |
| 42902.37436342593 | 9.037 |
| 42902.37438657407 | 9.085 |
| 42902.37440972222 | 9.111 |
| 42902.374432870376 | 9.231 |
| 42902.374444444446 | 9.379 |
| 42902.3744675926 | 9.53 |
| 42902.37449074074 | 9.657 |
| 42902.374502314815 | 9.765 |
| 42902.37452546296 | 9.861 |
| 42902.374548611115 | 9.932 |
| 42902.374571759254 | 9.996 |
| 42902.37458333334 | 10.073 |
| 42902.37460648148 | 10.121 |
| 42902.37462962963 | 10.163 |
| 42902.3746412037 | 10.225 |
| 42902.37466435185 | 10.265 |
| 42902.3746875 | 10.337 |
| 42902.374710648146 | 10.376 |
| 42902.37472222222 | 10.406 |
| 42902.37474537037 | 10.384 |
| 42902.37476851852 | 10.464 |
| 42902.37478009259 | 10.49 |
| 42902.37480324074 | 10.472 |
| 42902.374826388885 | 10.531 |
| 42902.37484953704 | 10.541 |
| 42902.37486111111 | 10.539 |
| 42902.37488425926 | 10.526 |
| 42902.37490740741 | 10.513 |
| 42902.374918981484 | 10.349 |
| 42902.37494212963 | 10.472 |
| 42902.37496527778 | 10.456 |
| 42902.37498842593 | 10.417 |
| 42902.375 | 10.339 |
| 42902.37502314815 | 10.355 |
| 42902.37504629629 | 10.33 |
| 42902.375069444446 | 10.253 |
| 42902.37509259259 | 10.279 |
| 42902.37511574074 | 10.282 |
| 42902.37513888889 | 10.237 |
| 42902.37515046296 | 10.312 |
| 42902.375173611115 | 10.324 |
| 42902.37519675926 | 10.32 |
| 42902.37520833334 | 10.368 |
| 42902.37523148148 | 10.415 |
| 42902.37525462963 | 10.418 |
| 42902.37527777778 | 10.492 |
| 42902.375289351854 | 10.555 |
| 42902.3753125 | 10.531 |
| 42902.37533564815 | 10.624 |
| 42902.37534722222 | 10.686 |
| 42902.37537037037 | 10.734 |
| 42902.37539351852 | 10.715 |
| 42902.37541666666 | 10.816 |
| 42902.375428240746 | 10.86 |
| 42902.375451388885 | 10.875 |
| 42902.37547453704 | 10.932 |
| 42902.37548611111 | 10.97 |
| 42902.37550925926 | 11.03 |
| 42902.3755324074 | 11.073 |
| 42902.375555555554 | 11.115 |
| 42902.375567129624 | 11.13 |
| 42902.37559027778 | 11.154 |
| 42902.37561342593 | 11.202 |
| 42902.37563657407 | 11.196 |
| 42902.375648148154 | 11.166 |
| 42902.37567129629 | 11.228 |
| 42902.37569444445 | 11.226 |
| 42902.375706018516 | 11.236 |
| 42902.37572916667 | 11.295 |
| 42902.37575231481 | 11.376 |
| 42902.37577546296 | 11.469 |
| 42902.37578703703 | 11.601 |
| 42902.375810185185 | 11.697 |
| 42902.37583333333 | 11.79 |
| 42902.37584490741 | 11.843 |
| 42902.375868055555 | 11.918 |
| 42902.3758912037 | 11.955 |
| 42902.375914351855 | 11.975 |
| 42902.375925925924 | 12.024 |
| 42902.37594907408 | 12.059 |
| 42902.37597222222 | 12.068 |
| 42902.3759837963 | 12.104 |
| 42902.37600694444 | 12.135 |
| 42902.37603009259 | 12.143 |
| 42902.37605324074 | 12.166 |
| 42902.376064814816 | 12.196 |
| 42902.37608796296 | 12.204 |
| 42902.37611111111 | 12.202 |
| 42902.376122685186 | 12.236 |
| 42902.37614583333 | 12.263 |
| 42902.376168981486 | 12.268 |
| 42902.376192129625 | 12.3 |
| 42902.37620370371 | 12.297 |
| 42902.37622685185 | 12.281 |
| 42902.37625 | 12.31 |
| 42902.37627314815 | 12.339 |
| 42902.376284722224 | 12.344 |
| 42902.37630787037 | 12.345 |
| 42902.37633101852 | 12.351 |
| 42902.37634259259 | 12.378 |
| 42902.37636574074 | 12.343 |
| 42902.37638888889 | 12.373 |
| 42902.37641203703 | 12.36 |
| 42902.37642361112 | 12.325 |
| 42902.376446759255 | 12.387 |
| 42902.37646990741 | 12.387 |
| 42902.37648148148 | 12.387 |
| 42902.37650462963 | 12.395 |
| 42902.37652777778 | 12.383 |
| 42902.376550925925 | 12.392 |
| 42902.376562499994 | 12.352 |
| 42902.37658564815 | 12.404 |
| 42902.3766087963 | 12.418 |
| 42902.37662037037 | 12.388 |
| 42902.376643518524 | 12.436 |
| 42902.37666666666 | 12.463 |
| 42902.37668981482 | 12.458 |
| 42902.37670138889 | 12.496 |
| 42902.37672453704 | 12.496 |
| 42902.37674768518 | 12.509 |
| 42902.37677083333 | 12.547 |
| 42902.3767824074 | 12.575 |
| 42902.376805555556 | 12.145 |
| 42902.37682870371 | 12.579 |
| 42902.37684027778 | 12.607 |
| 42902.376863425925 | 12.626 |
| 42902.37688657407 | 12.593 |
| 42902.376909722225 | 12.654 |
| 42902.376921296294 | 12.678 |
| 42902.37694444445 | 12.639 |
| 42902.37696759259 | 12.658 |
| 42902.37697916667 | 12.657 |
| 42902.37700231481 | 12.587 |
| 42902.37702546296 | 12.609 |
| 42902.37704861111 | 12.541 |
| 42902.37706018519 | 12.51 |
| 42902.37708333333 | 12.433 |
| 42902.37710648148 | 12.413 |
| 42902.377118055556 | 12.373 |
| 42902.3771412037 | 12.353 |
| 42902.377164351856 | 12.332 |
| 42902.377187499995 | 12.297 |
| 42902.37719907408 | 12.256 |
| 42902.37722222222 | 12.237 |
| 42902.37724537037 | 12.214 |
| 42902.37725694444 | 12.191 |
| 42902.377280092594 | 12.181 |
| 42902.37730324074 | 12.144 |
| 42902.37732638889 | 12.135 |
| 42902.377337962964 | 12.059 |
| 42902.37736111111 | 12.06 |
| 42902.37738425926 | 12.037 |
| 42902.3774074074 | 12.004 |
| 42902.37741898149 | 11.968 |
| 42902.377442129626 | 11.948 |
| 42902.37746527778 | 11.911 |
| 42902.37747685185 | 11.887 |
| 42902.3775 | 11.87 |
| 42902.37752314815 | 11.831 |
| 42902.377546296295 | 11.812 |
| 42902.37755787037 | 11.801 |
| 42902.37758101852 | 11.737 |
| 42902.37760416667 | 11.65 |
| 42902.37761574074 | 11.599 |
| 42902.377638888895 | 11.483 |
| 42902.37766203703 | 11.361 |
| 42902.37768518519 | 11.295 |
| 42902.37769675926 | 11.195 |
| 42902.37771990741 | 11.078 |
| 42902.37774305555 | 10.96 |
| 42902.37775462963 | 10.908 |
| 42902.37777777777 | 10.814 |
| 42902.377800925926 | 10.693 |
| 42902.37782407408 | 10.667 |
| 42902.37783564815 | 10.596 |
| 42902.3778587963 | 10.476 |
| 42902.37788194444 | 10.393 |
| 42902.377905092595 | 10.28 |
| 42902.377916666665 | 10.166 |
| 42902.37793981482 | 10.113 |
| 42902.37796296296 | 10.036 |
| 42902.37797453704 | 9.948 |
| 42902.37799768518 | 9.833 |
| 42902.378020833334 | 9.774 |
| 42902.37804398148 | 9.685 |
| 42902.37805555556 | 9.589 |
| 42902.3780787037 | 9.55 |
| 42902.37810185185 | 9.48 |
| 42902.378113425926 | 9.393 |
| 42902.37813657407 | 9.332 |
| 42902.378159722226 | 9.278 |
| 42902.378182870365 | 9.226 |
| 42902.37819444445 | 9.124 |
| 42902.37821759259 | 9.12 |
| 42902.37824074074 | 9.085 |
| 42902.37826388889 | 9.061 |
| 42902.378275462965 | 8.976 |
| 42902.37829861111 | 9.014 |
| 42902.37832175926 | 8.982 |
| 42902.378333333334 | 8.962 |
| 42902.37835648148 | 8.938 |
| 42902.378379629634 | 8.942 |
| 42902.37840277777 | 8.92 |
| 42902.37841435186 | 8.858 |
| 42902.378437499996 | 8.899 |
| 42902.37846064815 | 8.888 |
| 42902.37847222222 | 8.885 |
| 42902.37849537037 | 8.859 |
| 42902.37851851852 | 8.846 |
| 42902.378541666665 | 8.831 |
| 42902.37855324074 | 8.768 |
| 42902.37857638889 | 8.794 |
| 42902.37859953704 | 8.794 |
| 42902.37862268518 | 8.763 |
| 42902.378634259265 | 8.752 |
| 42902.378657407404 | 8.69 |
| 42902.37868055556 | 8.712 |
| 42902.37869212963 | 8.661 |
| 42902.37871527778 | 8.622 |
| 42902.37873842593 | 8.61 |
| 42902.37876157407 | 8.477 |
| 42902.37877314814 | 8.528 |
| 42902.378796296296 | 8.455 |
| 42902.37881944445 | 8.452 |
| 42902.37883101852 | 8.409 |
| 42902.37885416667 | 8.378 |
| 42902.37887731481 | 8.342 |
| 42902.378900462965 | 8.323 |
| 42902.378912037035 | 8.272 |
| 42902.37893518519 | 8.215 |
| 42902.37895833333 | 8.213 |
| 42902.37896990741 | 8.191 |
| 42902.37899305555 | 8.164 |
| 42902.379016203704 | 8.083 |
| 42902.37903935186 | 8.124 |
| 42902.37905092593 | 8.088 |
| 42902.37907407407 | 8.034 |
| 42902.37909722222 | 8.017 |
| 42902.37912037037 | 7.984 |
| 42902.37913194444 | 7.916 |
| 42902.379155092596 | 7.871 |
| 42902.379178240735 | 7.875 |
| 42902.37918981482 | 7.823 |
| 42902.37921296296 | 7.745 |
| 42902.37923611111 | 7.747 |
| 42902.37925925926 | 7.699 |
| 42902.379270833335 | 7.591 |
| 42902.37929398148 | 7.597 |
| 42902.37931712963 | 7.554 |
| 42902.379328703704 | 7.48 |
| 42902.37935185185 | 7.407 |
| 42902.379375000004 | 7.412 |
| 42902.37939814814 | 7.382 |
| 42902.37940972223 | 7.028 |
| 42902.379432870366 | 7.247 |
| 42902.37945601852 | 7.26 |
| 42902.37946759259 | 7.212 |
| 42902.37949074074 | 7.196 |
| 42902.37951388889 | 7.179 |
| 42902.379537037035 | 7.157 |
| 42902.37954861111 | 7.085 |
| 42902.37957175926 | 7.106 |
| 42902.37959490741 | 7.109 |
| 42902.37960648148 | 7.083 |
| 42902.379629629635 | 7.056 |
| 42902.379652777774 | 7.054 |
| 42902.37967592593 | 7.03 |
| 42902.3796875 | 7.007 |
| 42902.37971064815 | 6.986 |
| 42902.3797337963 | 6.988 |
| 42902.379745370374 | 6.961 |
| 42902.37976851852 | 6.937 |
| 42902.379791666666 | 6.943 |
| 42902.37981481482 | 6.923 |
| 42902.37982638889 | 6.921 |
| 42902.37984953704 | 6.882 |
| 42902.37987268518 | 6.912 |
| 42902.379895833335 | 6.893 |
| 42902.379907407405 | 6.868 |
| 42902.37993055556 | 6.832 |
| 42902.3799537037 | 6.832 |
| 42902.37996527778 | 6.819 |
| 42902.37998842592 | 6.794 |
| 42902.380011574074 | 6.742 |
| 42902.38003472223 | 6.737 |
| 42902.3800462963 | 6.708 |
| 42902.38006944445 | 6.71 |
| 42902.38009259259 | 6.658 |
| 42902.38010416667 | 6.664 |
| 42902.38012731481 | 6.662 |
| 42902.38015046297 | 6.64 |
| 42902.380173611105 | 6.569 |
| 42902.38018518519 | 6.617 |
| 42902.38020833333 | 6.616 |
| 42902.38023148148 | 6.59 |
| 42902.38025462963 | 6.605 |
| 42902.380266203705 | 6.582 |
| 42902.38028935185 | 6.557 |
| 42902.3803125 | 6.558 |
| 42902.380324074074 | 6.543 |
| 42902.38034722222 | 6.519 |
| 42902.380370370374 | 6.486 |
| 42902.38039351851 | 6.467 |
| 42902.3804050926 | 6.452 |
| 42902.38042824074 | 6.423 |
| 42902.38045138889 | 6.396 |
| 42902.38046296296 | 6.376 |
| 42902.38048611111 | 6.372 |
| 42902.38050925926 | 6.338 |
| 42902.380532407406 | 6.317 |
| 42902.38054398148 | 6.301 |
| 42902.38056712963 | 5.832 |
| 42902.38059027778 | 6.264 |
| 42902.38060185185 | 6.207 |
| 42902.380625000005 | 6.229 |
| 42902.380648148144 | 6.215 |
| 42902.3806712963 | 6.215 |
| 42902.38068287037 | 6.197 |
| 42902.38070601852 | 6.203 |
| 42902.38072916667 | 6.201 |
| 42902.380740740744 | 6.192 |
| 42902.38076388889 | 6.219 |
| 42902.38078703704 | 6.189 |
| 42902.38081018519 | 6.182 |
| 42902.38082175926 | 6.185 |
| 42902.38084490741 | 6.189 |
| 42902.38086805555 | 6.201 |
| 42902.380891203706 | 6.193 |
| 42902.380902777775 | 6.197 |
| 42902.38092592593 | 6.155 |
| 42902.380949074075 | 6.194 |
| 42902.38096064815 | 6.185 |
| 42902.38098379629 | 6.193 |
| 42902.381006944444 | 6.189 |
| 42902.3810300926 | 6.187 |
| 42902.38104166667 | 6.185 |
| 42902.38106481482 | 6.186 |
| 42902.38108796296 | 6.184 |
| 42902.381099537044 | 6.182 |
| 42902.38112268518 | 6.177 |
| 42902.38114583334 | 6.154 |
| 42902.381168981476 | 6.112 |
| 42902.38118055556 | 6.05 |
| 42902.3812037037 | 6.056 |
| 42902.38122685185 | 6.085 |
| 42902.38123842592 | 6.072 |
| 42902.381261574075 | 6.077 |
| 42902.38128472222 | 6.042 |
| 42902.38130787037 | 6.053 |
| 42902.381319444445 | 6.028 |
| 42902.38134259259 | 6.016 |
| 42902.381365740745 | 6 |
| 42902.381377314814 | 5.999 |
| 42902.38140046297 | 5.99 |
| 42902.38142361111 | 5.964 |
| 42902.38144675926 | 5.956 |
| 42902.38145833333 | 5.905 |
| 42902.38148148148 | 5.941 |
| 42902.38150462963 | 5.927 |
| 42902.381516203706 | 5.922 |
| 42902.38153935185 | 5.898 |
| 42902.3815625 | 5.893 |
| 42902.38158564815 | 5.812 |
| 42902.38159722222 | 5.883 |
| 42902.381620370375 | 5.872 |
| 42902.381643518514 | 5.834 |
| 42902.38166666667 | 5.874 |
| 42902.38167824074 | 5.93 |
| 42902.38170138889 | 5.592 |
| 42902.38172453704 | 6.021 |
| 42902.381736111114 | 6.157 |
| 42902.38175925926 | 6.238 |
| 42902.38178240741 | 6.195 |
| 42902.38180555556 | 6.357 |
| 42902.38181712963 | 6.506 |
| 42902.38184027778 | 6.601 |
| 42902.38186342592 | 6.164 |
| 42902.381875 | 6.708 |
| 42902.381898148145 | 6.772 |
| 42902.3819212963 | 6.819 |
| 42902.381944444445 | 6.85 |
| 42902.38195601852 | 6.897 |
| 42902.38197916667 | 6.925 |
| 42902.382002314815 | 6.918 |
| 42902.382013888884 | 6.996 |
| 42902.38203703704 | 7.017 |
| 42902.38206018519 | 7.011 |
| 42902.38208333333 | 7.081 |
| 42902.38209490741 | 7.114 |
| 42902.38211805555 | 7.142 |
| 42902.38214120371 | 7.158 |
| 42902.382164351846 | 7.198 |
| 42902.38217592593 | 7.22 |
| 42902.38219907407 | 7.228 |
| 42902.38222222222 | 7.228 |
| 42902.38223379629 | 7.238 |
| 42902.382256944446 | 7.238 |
| 42902.3822800926 | 7.251 |
| 42902.38230324074 | 7.278 |
| 42902.382314814815 | 7.291 |
| 42902.38233796296 | 7.307 |
| 42902.382361111115 | 7.326 |
| 42902.382372685184 | 7.281 |
| 42902.38239583334 | 7.35 |
| 42902.38241898148 | 7.351 |
| 42902.38244212963 | 7.336 |
| 42902.3824537037 | 7.354 |
| 42902.38247685185 | 7.393 |
| 42902.3825 | 7.419 |
| 42902.38251157408 | 7.452 |
| 42902.38253472222 | 7.483 |
| 42902.38255787037 | 7.548 |
| 42902.38258101852 | 7.61 |
| 42902.38259259259 | 7.645 |
| 42902.38261574074 | 7.713 |
| 42902.382638888885 | 7.782 |
| 42902.38265046296 | 7.822 |
| 42902.38267361111 | 7.879 |
| 42902.38269675926 | 7.889 |
| 42902.38271990741 | 7.977 |
| 42902.382731481484 | 8.01 |
| 42902.38275462963 | 8.047 |
| 42902.38277777778 | 8.102 |
| 42902.38280092593 | 8.121 |
| 42902.3828125 | 8.133 |
| 42902.38283564815 | 8.172 |
| 42902.38285879629 | 8.218 |
| 42902.38287037037 | 8.23 |
| 42902.382893518516 | 8.269 |
| 42902.38291666667 | 8.268 |
| 42902.382939814815 | 8.324 |
| 42902.38295138889 | 8.341 |
| 42902.38297453704 | 8.354 |
| 42902.382997685185 | 8.381 |
| 42902.38300925926 | 8.409 |
| 42902.38303240741 | 8.452 |
| 42902.38305555556 | 8.501 |
| 42902.3830787037 | 8.548 |
| 42902.38309027778 | 8.553 |
| 42902.38311342592 | 8.657 |
| 42902.38313657408 | 8.714 |
| 42902.38315972222 | 8.748 |
| 42902.3831712963 | 8.772 |
| 42902.38319444444 | 8.8 |
| 42902.38321759259 | 8.815 |
| 42902.38322916666 | 8.818 |
| 42902.383252314816 | 8.811 |
| 42902.38327546297 | 8.82 |
| 42902.38329861111 | 8.817 |
| 42902.383310185185 | 8.808 |
| 42902.38333333333 | 8.796 |
| 42902.383356481485 | 8.786 |
| 42902.383368055554 | 8.777 |
| 42902.38339120371 | 8.763 |
| 42902.38341435185 | 8.764 |
| 42902.3834375 | 8.748 |
| 42902.383460648154 | 8.711 |
| 42902.383472222224 | 8.735 |
| 42902.38349537037 | 8.71 |
| 42902.383518518516 | 8.714 |
| 42902.38353009259 | 8.69 |
| 42902.38355324074 | 8.713 |
| 42902.38357638889 | 8.693 |
| 42902.38359953703 | 8.688 |
| 42902.383611111116 | 8.636 |
| 42902.383634259255 | 8.692 |
| 42902.38365740741 | 8.685 |
| 42902.38366898148 | 8.701 |
| 42902.38369212963 | 8.683 |
| 42902.38371527778 | 8.685 |
| 42902.383738425924 | 8.656 |
| 42902.38375 | 8.657 |
| 42902.38377314815 | 8.641 |
| 42902.3837962963 | 8.634 |
| 42902.38380787037 | 8.629 |
| 42902.38383101852 | 8.646 |
| 42902.38385416666 | 8.633 |
| 42902.383877314816 | 8.581 |
| 42902.383888888886 | 8.626 |
| 42902.38391203704 | 8.622 |
| 42902.383935185186 | 8.633 |
| 42902.38395833333 | 8.622 |
| 42902.38396990741 | 8.626 |
| 42902.383993055555 | 8.63 |
| 42902.38401620371 | 8.622 |
| 42902.38402777778 | 8.629 |
| 42902.38405092593 | 8.632 |
| 42902.38407407407 | 8.601 |
| 42902.384097222224 | 8.608 |
| 42902.384108796294 | 8.6 |
| 42902.38413194445 | 8.596 |
| 42902.38415509259 | 8.601 |
| 42902.38416666667 | 8.576 |
| 42902.38418981482 | 8.582 |
| 42902.38421296296 | 8.596 |
| 42902.38423611112 | 8.587 |
| 42902.384247685186 | 8.609 |
| 42902.38427083334 | 8.609 |
| 42902.38429398148 | 8.604 |
| 42902.384305555555 | 8.62 |
| 42902.3843287037 | 8.626 |
| 42902.384351851855 | 8.636 |
| 42902.384374999994 | 8.626 |
| 42902.38438657408 | 8.626 |
| 42902.38440972222 | 8.62 |
| 42902.38443287037 | 8.631 |
| 42902.38444444444 | 8.585 |
| 42902.384467592594 | 8.573 |
| 42902.38449074075 | 8.585 |
| 42902.38451388889 | 8.585 |
| 42902.384525462956 | 8.587 |
| 42902.38454861111 | 8.584 |
| 42902.38457175926 | 8.587 |
| 42902.38458333333 | 8.577 |
| 42902.384606481486 | 8.489 |
| 42902.384629629625 | 8.564 |
| 42902.38465277778 | 8.566 |
| 42902.38466435185 | 8.582 |
| 42902.3846875 | 8.576 |
| 42902.38471064815 | 8.573 |
| 42902.384733796294 | 8.559 |
| 42902.38474537037 | 8.563 |
| 42902.38476851852 | 8.597 |
| 42902.38479166667 | 8.557 |
| 42902.38480324074 | 8.498 |
| 42902.38482638889 | 8.544 |
| 42902.38484953703 | 8.527 |
| 42902.38486111111 | 8.513 |
| 42902.384884259256 | 8.511 |
| 42902.38490740741 | 8.459 |
| 42902.384930555556 | 8.495 |
| 42902.38494212963 | 8.472 |
| 42902.38496527778 | 8.448 |
| 42902.384988425925 | 8.409 |
| 42902.38501157408 | 8.391 |
| 42902.38502314815 | 8.364 |
| 42902.385046296295 | 8.342 |
| 42902.38506944444 | 8.344 |
| 42902.38508101852 | 8.305 |
| 42902.385104166664 | 8.301 |
| 42902.38512731482 | 8.291 |
| 42902.385150462964 | 8.299 |
| 42902.38516203704 | 8.246 |
| 42902.38518518519 | 8.258 |
| 42902.38520833333 | 8.258 |
| 42902.3852199074 | 8.219 |
| 42902.385243055556 | 8.233 |
| 42902.38526620371 | 8.232 |
| 42902.38528935185 | 8.217 |
| 42902.385300925926 | 8.198 |
| 42902.38532407407 | 8.181 |
| 42902.385347222225 | 8.103 |
| 42902.385358796295 | 8.104 |
| 42902.38538194445 | 8.098 |
| 42902.38540509259 | 8.095 |
| 42902.38542824074 | 8.075 |
| 42902.38543981481 | 8.076 |
| 42902.385462962964 | 8.052 |
| 42902.38548611112 | 8.042 |
| 42902.38550925926 | 8.036 |
| 42902.38552083333 | 8.007 |
| 42902.38554398148 | 8.021 |
| 42902.38556712963 | 8.015 |
| 42902.3855787037 | 8.024 |
| 42902.385601851856 | 7.99 |
| 42902.385624999995 | 7.968 |
| 42902.38564814815 | 7.961 |
| 42902.38565972222 | 7.94 |
| 42902.38568287037 | 7.945 |
| 42902.38570601852 | 7.94 |
| 42902.385717592595 | 7.929 |
| 42902.385740740734 | 7.923 |
| 42902.38576388889 | 7.908 |
| 42902.38578703704 | 7.895 |
| 42902.38579861111 | 7.854 |
| 42902.385821759264 | 7.876 |
| 42902.3858449074 | 7.88 |
| 42902.38585648148 | 7.866 |
| 42902.385879629626 | 7.842 |
| 42902.38590277778 | 7.845 |
| 42902.385925925926 | 7.851 |
| 42902.3859375 | 7.829 |
| 42902.38596064815 | 7.843 |
| 42902.385983796295 | 7.866 |
| 42902.385995370365 | 7.802 |
| 42902.38601851852 | 7.835 |
| 42902.386041666665 | 7.825 |
| 42902.38606481481 | 7.809 |
| 42902.38607638889 | 7.763 |
| 42902.386099537034 | 7.786 |
| 42902.38612268519 | 7.766 |
| 42902.386145833334 | 7.775 |
| 42902.38615740741 | 7.76 |
| 42902.38618055556 | 7.715 |
| 42902.3862037037 | 7.71 |
| 42902.38621527777 | 7.722 |
| 42902.38623842593 | 7.721 |
| 42902.38626157407 | 7.73 |
| 42902.38628472222 | 7.708 |
| 42902.386296296296 | 7.681 |
| 42902.38631944444 | 7.693 |
| 42902.386342592596 | 7.685 |
| 42902.386354166665 | 7.669 |
| 42902.38637731482 | 7.662 |
| 42902.386400462965 | 7.668 |
| 42902.38642361111 | 7.657 |
| 42902.38643518518 | 7.659 |
| 42902.386458333334 | 7.648 |
| 42902.38648148149 | 7.649 |
| 42902.38649305556 | 7.636 |
| 42902.386516203704 | 7.667 |
| 42902.38653935185 | 7.65 |
| 42902.3865625 | 7.627 |
| 42902.38657407407 | 7.657 |
| 42902.38659722223 | 7.66 |
| 42902.386620370366 | 7.656 |
| 42902.38664351852 | 7.642 |
| 42902.38665509259 | 7.649 |
| 42902.38667824074 | 7.642 |
| 42902.386701388896 | 7.622 |
| 42902.386712962965 | 7.634 |
| 42902.386736111104 | 7.629 |
| 42902.38675925926 | 7.634 |
| 42902.38678240741 | 7.629 |
| 42902.38679398148 | 7.626 |
| 42902.386817129634 | 7.612 |
| 42902.38684027777 | 7.605 |
| 42902.38685185186 | 7.569 |
| 42902.386875 | 7.512 |
| 42902.38689814815 | 7.47 |
| 42902.386921296296 | 7.346 |
| 42902.38693287037 | 7.434 |
| 42902.38695601851 | 7.406 |
| 42902.386979166666 | 7.387 |
| 42902.386990740735 | 7.372 |
| 42902.38701388889 | 7.361 |
| 42902.387037037035 | 7.335 |
| 42902.38706018518 | 7.325 |
| 42902.38707175926 | 7.291 |
| 42902.387094907404 | 7.287 |
| 42902.38711805556 | 7.27 |
| 42902.38712962963 | 7.261 |
| 42902.38715277778 | 7.242 |
| 42902.38717592593 | 7.23 |
| 42902.38719907407 | 7.21 |
| 42902.38721064814 | 7.195 |
| 42902.3872337963 | 7.156 |
| 42902.38725694444 | 7.135 |
| 42902.38728009259 | 6.889 |
| 42902.387291666666 | 7.091 |
| 42902.38731481481 | 7.085 |
| 42902.387337962966 | 7.069 |
| 42902.387349537035 | 7.097 |
| 42902.38737268519 | 7.038 |
| 42902.387395833335 | 7.012 |
| 42902.38741898148 | 6.981 |
| 42902.38743055555 | 6.998 |
| 42902.387453703705 | 6.998 |
| 42902.38747685185 | 6.997 |
| 42902.38748842593 | 6.983 |
| 42902.387511574074 | 6.966 |
| 42902.38753472222 | 6.978 |
| 42902.387557870374 | 6.977 |
| 42902.38758101852 | 6.977 |
| 42902.3875925926 | 6.973 |
| 42902.387615740736 | 6.963 |
| 42902.38763888889 | 6.984 |
| 42902.38765046296 | 6.975 |
| 42902.38767361111 | 6.964 |
| 42902.387696759266 | 6.966 |
| 42902.387719907405 | 6.943 |
| 42902.38773148148 | 6.938 |
| 42902.38775462963 | 6.972 |
| 42902.38777777778 | 6.962 |
| 42902.38778935185 | 6.945 |
| 42902.387812500005 | 6.929 |
| 42902.387835648144 | 6.953 |
| 42902.3878587963 | 6.95 |
| 42902.38787037037 | 6.94 |
| 42902.38789351852 | 6.948 |
| 42902.38791666667 | 6.953 |
| 42902.38792824074 | 6.937 |
| 42902.38795138888 | 6.938 |
| 42902.387974537036 | 6.911 |
| 42902.38799768519 | 6.916 |
| 42902.38800925926 | 6.912 |
| 42902.38803240741 | 6.925 |
| 42902.38805555555 | 6.913 |
| 42902.38806712963 | 6.907 |
| 42902.388090277775 | 6.899 |
| 42902.38811342593 | 6.888 |
| 42902.388136574074 | 6.891 |
| 42902.38814814815 | 6.865 |
| 42902.38817129629 | 6.912 |
| 42902.388194444444 | 6.896 |
| 42902.3882175926 | 6.894 |
| 42902.38822916667 | 6.901 |
| 42902.38825231481 | 6.916 |
| 42902.38827546296 | 6.907 |
| 42902.388287037036 | 6.898 |
| 42902.38831018518 | 6.92 |
| 42902.388333333336 | 6.916 |
| 42902.38835648148 | 6.923 |
| 42902.38836805556 | 6.92 |
| 42902.388391203705 | 6.933 |
| 42902.38841435185 | 6.928 |
| 42902.38842592592 | 6.928 |
| 42902.388449074075 | 6.894 |
| 42902.38847222222 | 6.955 |
| 42902.38849537037 | 6.945 |
| 42902.388506944444 | 6.955 |
| 42902.38853009259 | 6.948 |
| 42902.388553240744 | 6.955 |
| 42902.38857638889 | 6.965 |
| 42902.38858796297 | 6.978 |
| 42902.38861111111 | 6.925 |
| 42902.38863425926 | 6.968 |
| 42902.38864583333 | 6.976 |
| 42902.38866898148 | 6.98 |
| 42902.38869212963 | 6.997 |
| 42902.388715277775 | 7.008 |
| 42902.38872685185 | 7.017 |
| 42902.38875 | 7.015 |
| 42902.38877314815 | 7.021 |
| 42902.38878472222 | 7.064 |
| 42902.388807870375 | 7.083 |
| 42902.388831018514 | 7.098 |
| 42902.38885416667 | 7.118 |
| 42902.38886574074 | 7.138 |
| 42902.38888888889 | 7.117 |
| 42902.388912037044 | 7.169 |
| 42902.38892361111 | 7.197 |
| 42902.38894675925 | 7.211 |
| 42902.388969907406 | 7.201 |
| 42902.38899305556 | 7.244 |
| 42902.38900462963 | 7.26 |
| 42902.38902777778 | 7.295 |
| 42902.38905092592 | 7.292 |
| 42902.389074074075 | 7.287 |
| 42902.389085648145 | 7.276 |
| 42902.3891087963 | 7.297 |
| 42902.389131944445 | 7.276 |
| 42902.38914351852 | 7.266 |
| 42902.38916666666 | 7.33 |
| 42902.389189814814 | 7.358 |
| 42902.38921296297 | 7.367 |
| 42902.38922453704 | 7.364 |
| 42902.38924768518 | 7.39 |
| 42902.38927083333 | 7.393 |
| 42902.38928240741 | 7.386 |
| 42902.38930555555 | 7.388 |
| 42902.389328703706 | 7.405 |
| 42902.38935185185 | 7.438 |
| 42902.38936342593 | 7.438 |
| 42902.38938657407 | 7.46 |
| 42902.38940972222 | 7.474 |
| 42902.389432870375 | 7.457 |
| 42902.389444444445 | 7.449 |
| 42902.38946759259 | 7.449 |
| 42902.38949074074 | 7.418 |
| 42902.389502314814 | 7.455 |
| 42902.38952546296 | 7.479 |
| 42902.389548611114 | 7.477 |
| 42902.38957175926 | 7.463 |
| 42902.38958333334 | 7.494 |
| 42902.38960648148 | 7.496 |
| 42902.38962962963 | 7.516 |
| 42902.3896412037 | 7.502 |
| 42902.38966435185 | 7.538 |
| 42902.3896875 | 7.542 |
| 42902.389710648145 | 7.556 |
| 42902.38972222222 | 7.571 |
| 42902.38974537037 | 7.593 |
| 42902.38976851852 | 7.616 |
| 42902.38978009259 | 7.597 |
| 42902.389803240745 | 7.596 |
| 42902.389826388884 | 7.642 |
| 42902.38984953704 | 7.653 |
| 42902.38986111111 | 7.672 |
| 42902.38988425926 | 7.69 |
| 42902.38990740741 | 7.675 |
| 42902.389918981484 | 7.687 |
| 42902.38994212963 | 7.73 |
| 42902.389965277776 | 7.732 |
| 42902.38998842593 | 7.743 |
| 42902.39 | 7.768 |
| 42902.39002314815 | 7.745 |
| 42902.39004629629 | 7.769 |
| 42902.390069444446 | 7.8 |
| 42902.390081018515 | 7.802 |
| 42902.39010416667 | 7.769 |
| 42902.390127314815 | 7.83 |
| 42902.39013888889 | 7.853 |
| 42902.39016203703 | 7.842 |
| 42902.390185185184 | 7.909 |
| 42902.39020833334 | 7.935 |
| 42902.39021990741 | 7.945 |
| 42902.39024305556 | 7.963 |
| 42902.3902662037 | 8.002 |
| 42902.39027777778 | 8.013 |
| 42902.39030092592 | 8.02 |
| 42902.39032407408 | 8.038 |
| 42902.39034722222 | 8.101 |
| 42902.3903587963 | 8.107 |
| 42902.39038194444 | 8.145 |
| 42902.39040509259 | 8.183 |
| 42902.39041666666 | 8.217 |
| 42902.390439814815 | 8.242 |
| 42902.39046296296 | 8.27 |
| 42902.39048611111 | 8.303 |
| 42902.390497685185 | 8.363 |
| 42902.39052083333 | 8.408 |
| 42902.390543981484 | 8.453 |
| 42902.39056712963 | 8.487 |
| 42902.39057870371 | 8.529 |
| 42902.39060185185 | 8.563 |
| 42902.390625 | 8.586 |
| 42902.39063657407 | 8.604 |
| 42902.39065972222 | 8.617 |
| 42902.39068287037 | 8.632 |
| 42902.390706018516 | 8.667 |
| 42902.39071759259 | 8.7 |
| 42902.39074074074 | 8.724 |
| 42902.39076388889 | 8.736 |
| 42902.39077546296 | 8.768 |
| 42902.390798611115 | 8.766 |
| 42902.39082175926 | 8.823 |
| 42902.39084490741 | 8.847 |
| 42902.39085648148 | 8.792 |
| 42902.39087962963 | 8.893 |
| 42902.39090277778 | 8.924 |
| 42902.390914351854 | 8.91 |
| 42902.3909375 | 8.975 |
| 42902.39096064815 | 9.001 |
| 42902.3909837963 | 8.999 |
| 42902.39099537037 | 9.011 |
| 42902.39101851852 | 9.026 |
| 42902.39104166666 | 9.062 |
| 42902.391064814816 | 9.081 |
| 42902.391076388885 | 9.087 |
| 42902.39109953704 | 9.102 |
| 42902.391122685185 | 9.092 |
| 42902.39113425926 | 9.06 |
| 42902.3911574074 | 9.085 |
| 42902.391180555554 | 9.134 |
| 42902.39120370371 | 9.132 |
| 42902.39121527778 | 9.135 |
| 42902.39123842593 | 9.152 |
| 42902.39126157407 | 9.181 |